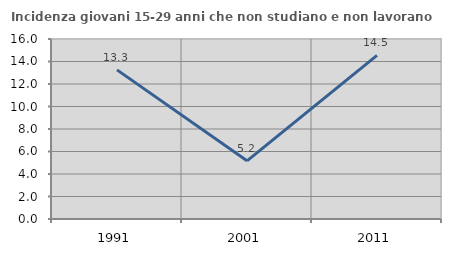
| Category | Incidenza giovani 15-29 anni che non studiano e non lavorano  |
|---|---|
| 1991.0 | 13.257 |
| 2001.0 | 5.172 |
| 2011.0 | 14.545 |